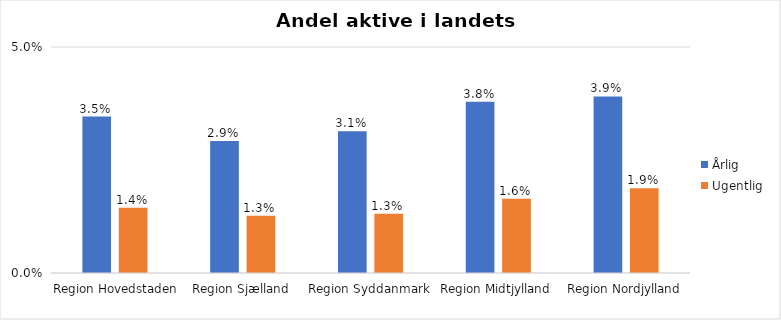
| Category | Årlig | Ugentlig |
|---|---|---|
| Region Hovedstaden | 0.035 | 0.014 |
| Region Sjælland | 0.029 | 0.013 |
| Region Syddanmark | 0.031 | 0.013 |
| Region Midtjylland | 0.038 | 0.016 |
| Region Nordjylland | 0.039 | 0.019 |